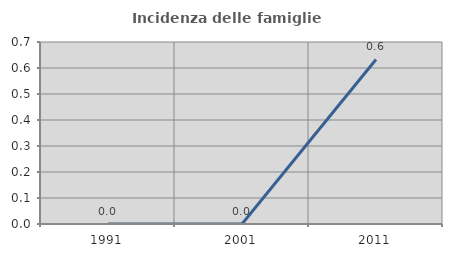
| Category | Incidenza delle famiglie numerose |
|---|---|
| 1991.0 | 0 |
| 2001.0 | 0 |
| 2011.0 | 0.633 |